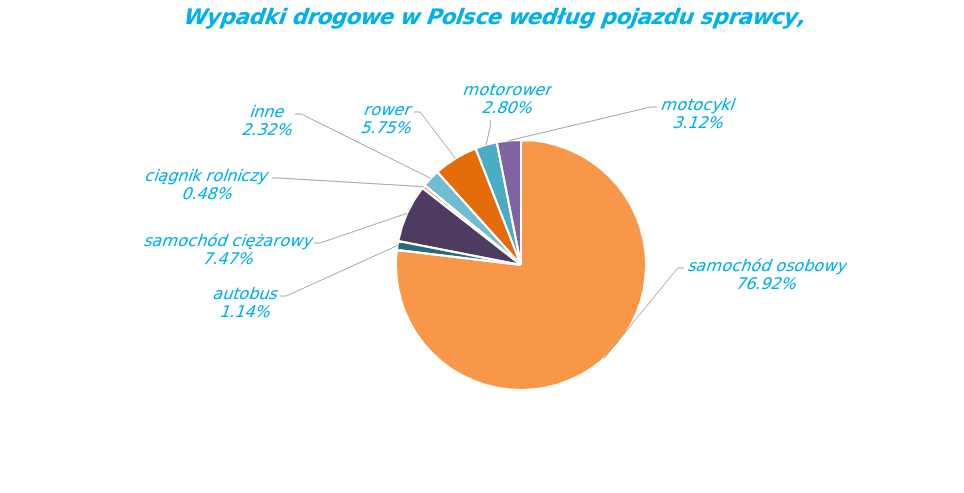
| Category | Series 0 |
|---|---|
| rower | 2205 |
| motorower | 1073 |
| motocykl | 1195 |
| samochód osobowy | 29475 |
| autobus | 436 |
| samochód ciężarowy | 2864 |
| ciągnik rolniczy | 182 |
| inne | 888 |